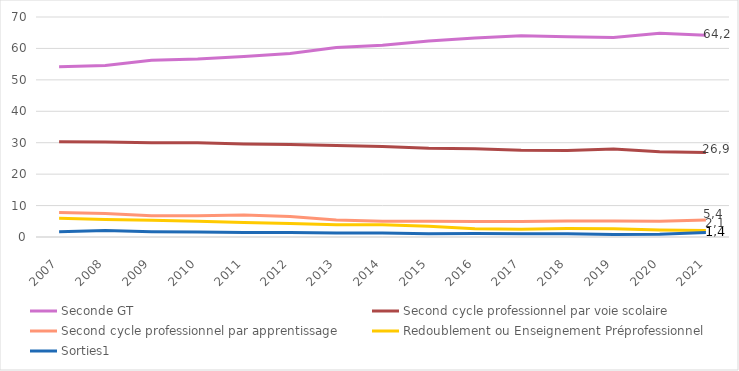
| Category | Seconde GT | Second cycle professionnel par voie scolaire | Second cycle professionnel par apprentissage | Redoublement ou Enseignement Préprofessionnel | Sorties1 |
|---|---|---|---|---|---|
| 2007.0 | 54.2 | 30.3 | 7.8 | 6 | 1.7 |
| 2008.0 | 54.6 | 30.2 | 7.5 | 5.6 | 2.1 |
| 2009.0 | 56.2 | 30 | 6.8 | 5.3 | 1.7 |
| 2010.0 | 56.6 | 30 | 6.8 | 5 | 1.6 |
| 2011.0 | 57.4 | 29.6 | 7 | 4.6 | 1.4 |
| 2012.0 | 58.4 | 29.4 | 6.5 | 4.3 | 1.4 |
| 2013.0 | 60.3 | 29.1 | 5.4 | 3.9 | 1.3 |
| 2014.0 | 61 | 28.8 | 5 | 3.9 | 1.3 |
| 2015.0 | 62.4 | 28.2 | 5 | 3.4 | 1 |
| 2016.0 | 63.3 | 28.1 | 4.9 | 2.6 | 1.1 |
| 2017.0 | 64 | 27.6 | 4.9 | 2.5 | 1 |
| 2018.0 | 63.7 | 27.5 | 5.1 | 2.7 | 1 |
| 2019.0 | 63.5 | 28 | 5.1 | 2.6 | 0.8 |
| 2020.0 | 64.8 | 27.1 | 5 | 2.2 | 0.9 |
| 2021.0 | 64.2 | 26.9 | 5.4 | 2.1 | 1.4 |